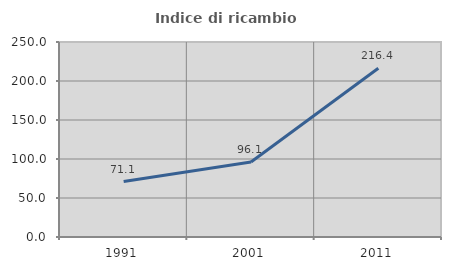
| Category | Indice di ricambio occupazionale  |
|---|---|
| 1991.0 | 71.13 |
| 2001.0 | 96.121 |
| 2011.0 | 216.364 |